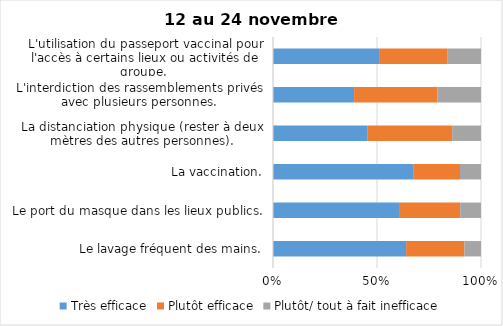
| Category | Très efficace | Plutôt efficace | Plutôt/ tout à fait inefficace |
|---|---|---|---|
| Le lavage fréquent des mains. | 64 | 28 | 8 |
| Le port du masque dans les lieux publics. | 61 | 29 | 10 |
| La vaccination. | 67 | 22 | 10 |
| La distanciation physique (rester à deux mètres des autres personnes). | 46 | 41 | 14 |
| L'interdiction des rassemblements privés avec plusieurs personnes. | 39 | 40 | 21 |
| L'utilisation du passeport vaccinal pour l'accès à certains lieux ou activités de groupe.  | 51 | 33 | 16 |